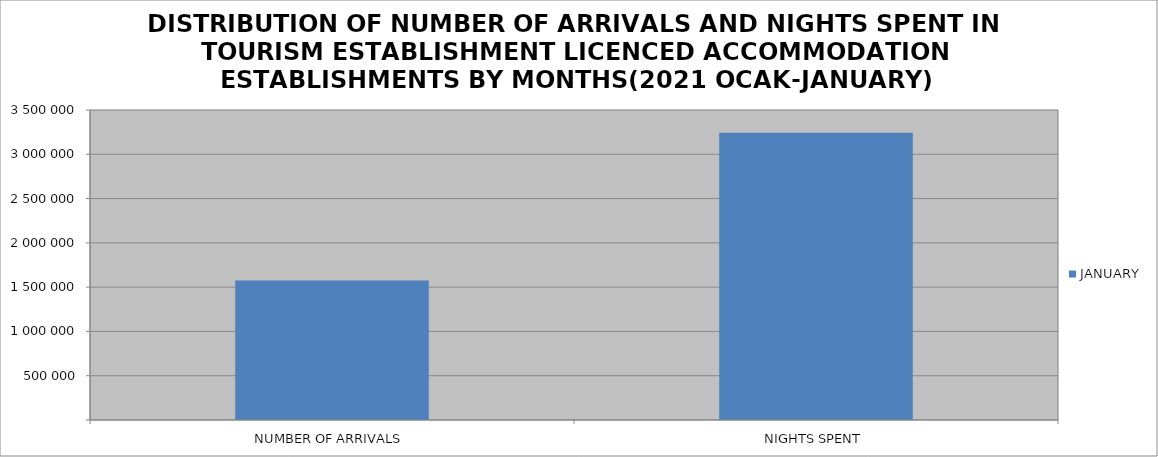
| Category | JANUARY |
|---|---|
| NUMBER OF ARRIVALS | 1573897 |
| NIGHTS SPENT | 3243443 |